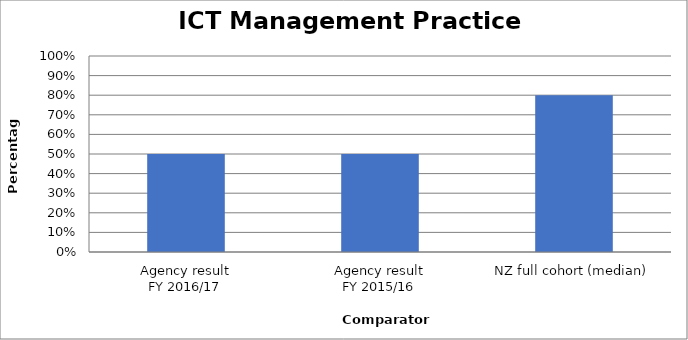
| Category | Result |
|---|---|
| Agency result
FY 2016/17 | 0.5 |
| Agency result
FY 2015/16 | 0.5 |
| NZ full cohort (median) | 0.8 |